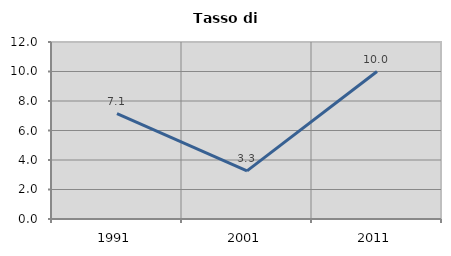
| Category | Tasso di disoccupazione   |
|---|---|
| 1991.0 | 7.143 |
| 2001.0 | 3.261 |
| 2011.0 | 10 |